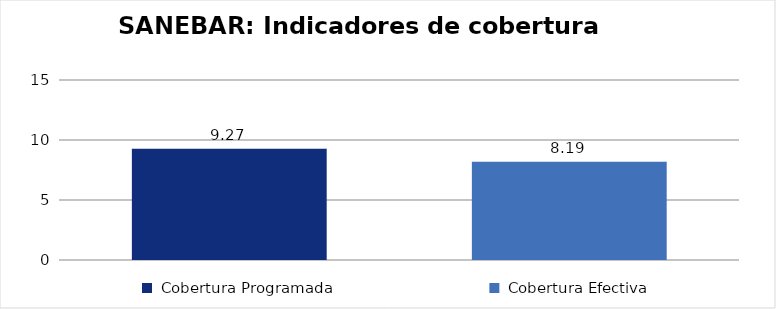
| Category |  Total Programa  |
|---|---|
|  Cobertura Programada  | 9.274 |
|  Cobertura Efectiva  | 8.19 |